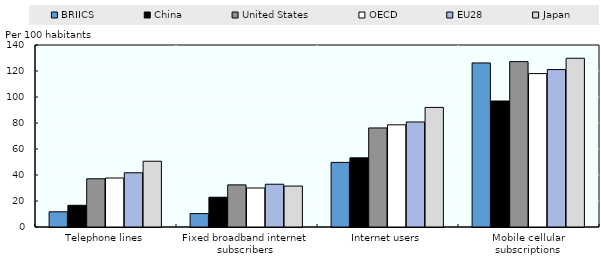
| Category | BRIICS | China | United States | OECD | EU28 | Japan |
|---|---|---|---|---|---|---|
| Telephone lines | 11.7 | 16.7 | 37.1 | 37.7 | 41.7 | 50.6 |
| Fixed broadband internet subscribers | 10.3 | 22.9 | 32.4 | 30 | 32.9 | 31.5 |
| Internet users | 49.7 | 53.2 | 76.2 | 78.6 | 80.8 | 92 |
| Mobile cellular subscriptions | 126.2 | 96.9 | 127.2 | 118 | 121.1 | 129.8 |